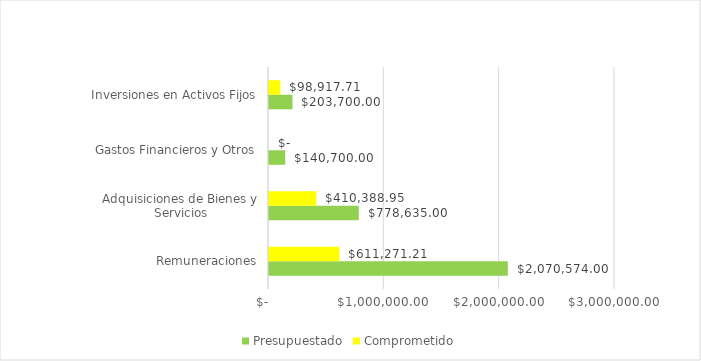
| Category | Presupuestado | Comprometido |
|---|---|---|
| Remuneraciones | 2070574 | 611271.21 |
| Adquisiciones de Bienes y Servicios | 778635 | 410388.95 |
| Gastos Financieros y Otros | 140700 | 0 |
| Inversiones en Activos Fijos | 203700 | 98917.71 |